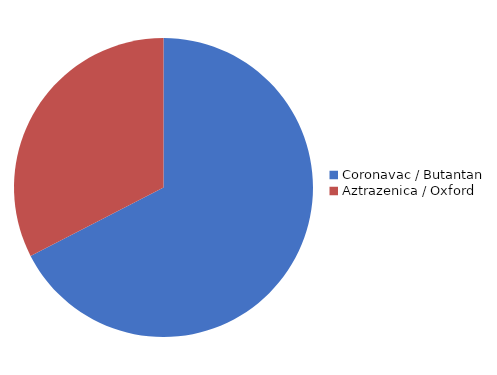
| Category | Series 0 |
|---|---|
| Coronavac / Butantan | 46550 |
| Aztrazenica / Oxford | 22475 |